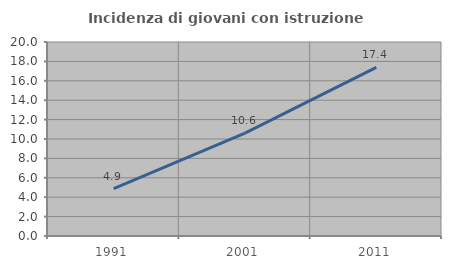
| Category | Incidenza di giovani con istruzione universitaria |
|---|---|
| 1991.0 | 4.887 |
| 2001.0 | 10.611 |
| 2011.0 | 17.376 |